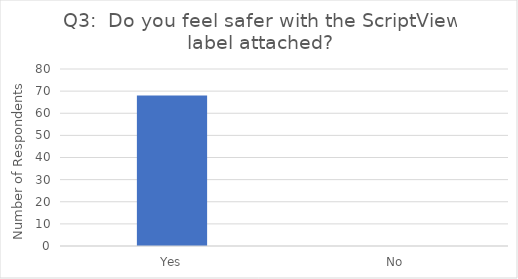
| Category | Series 0 |
|---|---|
| Yes | 68 |
| No | 0 |